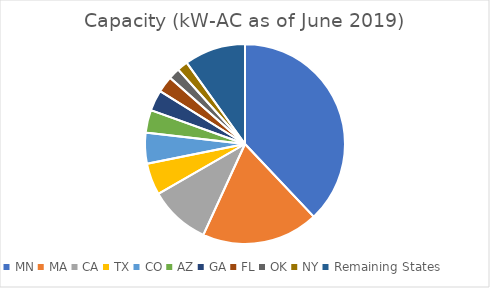
| Category |  Capacity (kW-AC as of June 2019)  |
|---|---|
| MN | 509633.262 |
| MA | 253701.397 |
| CA | 132270 |
| TX | 69095 |
| CO | 67021.345 |
| AZ | 49247 |
| GA | 45154.92 |
| FL | 35717.6 |
| OK | 24808.52 |
| NY | 23198.991 |
| Remaining States | 133069.722 |